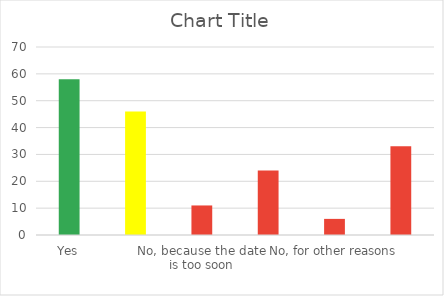
| Category | Series 0 |
|---|---|
| Yes | 58 |
| uncertain | 46 |
| No, because the date is too soon | 11 |
| No, because of the location | 24 |
| No, for other reasons | 6 |
| No, because I do not attend IEEE 802 Wireless Interims | 33 |